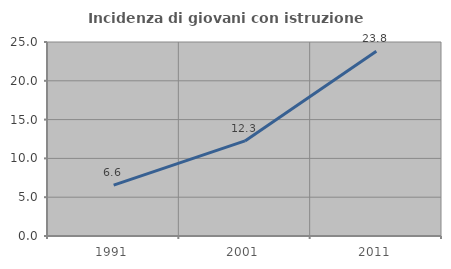
| Category | Incidenza di giovani con istruzione universitaria |
|---|---|
| 1991.0 | 6.553 |
| 2001.0 | 12.255 |
| 2011.0 | 23.795 |